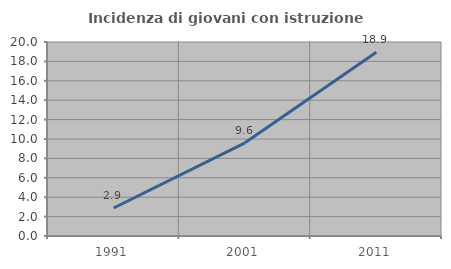
| Category | Incidenza di giovani con istruzione universitaria |
|---|---|
| 1991.0 | 2.885 |
| 2001.0 | 9.603 |
| 2011.0 | 18.932 |